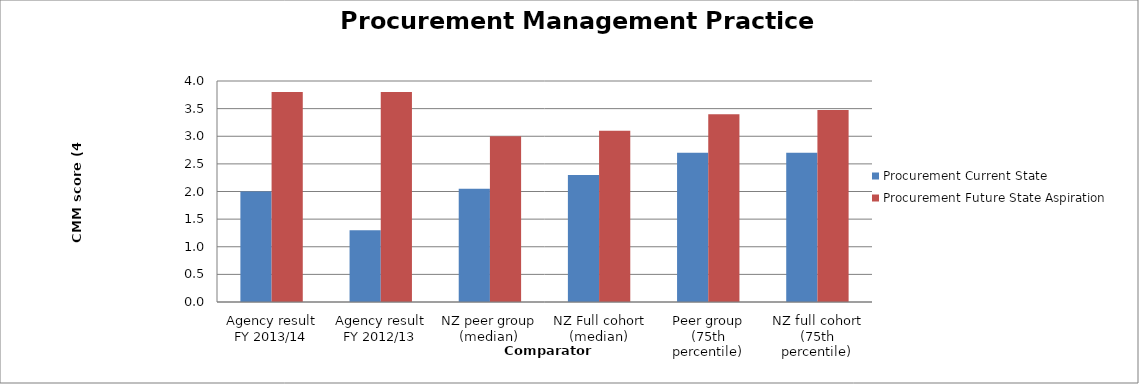
| Category | Procurement Current State | Procurement Future State Aspiration |
|---|---|---|
| Agency result FY 2013/14 | 2 | 3.8 |
| Agency result FY 2012/13 | 1.3 | 3.8 |
| NZ peer group (median) | 2.05 | 3 |
| NZ Full cohort (median) | 2.3 | 3.1 |
| Peer group (75th percentile) | 2.7 | 3.4 |
| NZ full cohort (75th percentile) | 2.7 | 3.475 |